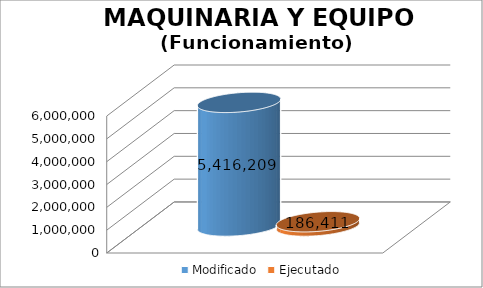
| Category | Modificado | Ejecutado |
|---|---|---|
| 0 | 5416209 | 186411.13 |